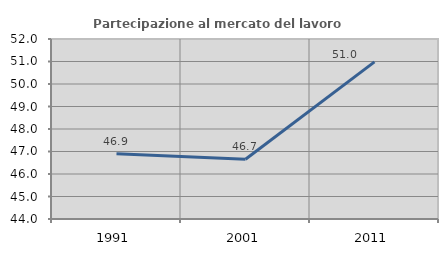
| Category | Partecipazione al mercato del lavoro  femminile |
|---|---|
| 1991.0 | 46.904 |
| 2001.0 | 46.654 |
| 2011.0 | 50.982 |